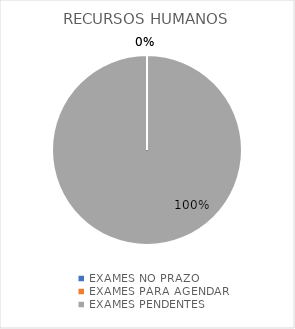
| Category | RECURSOS HUMANOS |
|---|---|
| EXAMES NO PRAZO | 0 |
| EXAMES PARA AGENDAR | 0 |
| EXAMES PENDENTES | 1 |